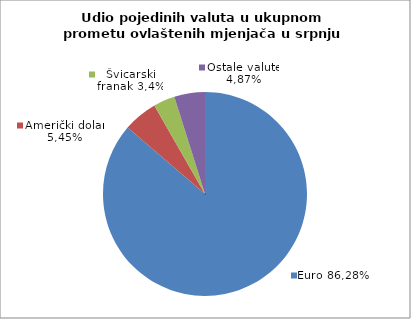
| Category | EUR |
|---|---|
| 0 | 86.284 |
| 1 | 5.449 |
| 2 | 3.399 |
| 3 | 4.868 |